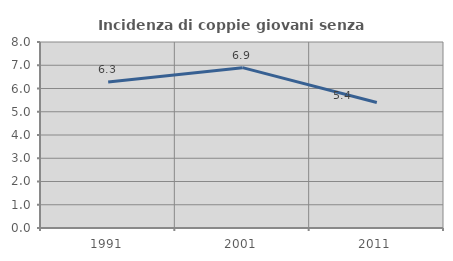
| Category | Incidenza di coppie giovani senza figli |
|---|---|
| 1991.0 | 6.28 |
| 2001.0 | 6.897 |
| 2011.0 | 5.401 |